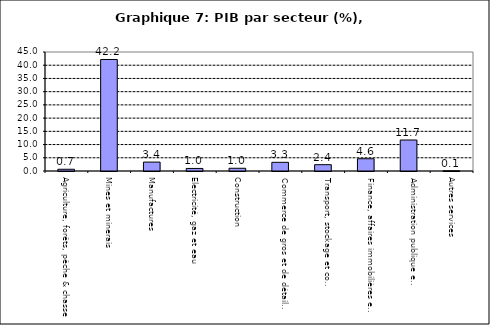
| Category | Series 0 |
|---|---|
| Agriculture, forêts, pêche & chasse | 0.662 |
| Mines et minerais | 42.165 |
| Manufactures | 3.371 |
| Electricité, gaz et eau | 0.966 |
| Construction | 1.031 |
| Commerce de gros et de détail, hôtels et restaurants | 3.283 |
| Transport, stockage et communications                | 2.393 |
| Finance, affaires immobilières et services | 4.637 |
| Administration publique et defense       | 11.718 |
| Autres services                        | 0.066 |